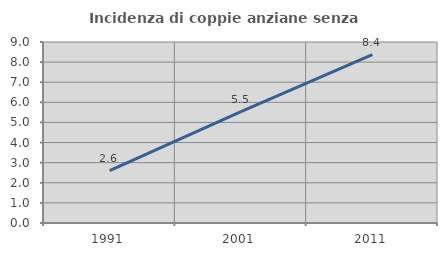
| Category | Incidenza di coppie anziane senza figli  |
|---|---|
| 1991.0 | 2.602 |
| 2001.0 | 5.535 |
| 2011.0 | 8.367 |